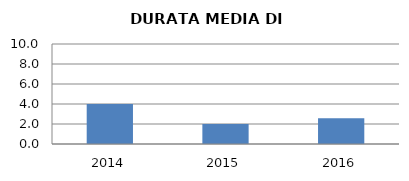
| Category | 2014 2015 2016 |
|---|---|
| 2014.0 | 4 |
| 2015.0 | 2 |
| 2016.0 | 2.571 |